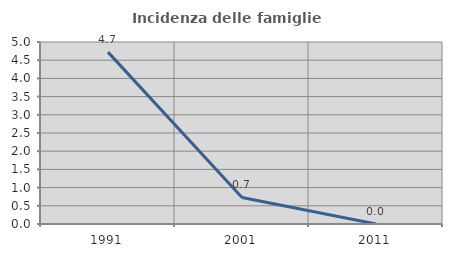
| Category | Incidenza delle famiglie numerose |
|---|---|
| 1991.0 | 4.722 |
| 2001.0 | 0.73 |
| 2011.0 | 0 |